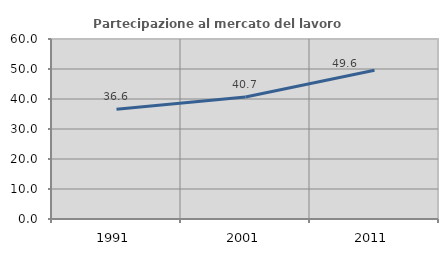
| Category | Partecipazione al mercato del lavoro  femminile |
|---|---|
| 1991.0 | 36.561 |
| 2001.0 | 40.658 |
| 2011.0 | 49.555 |